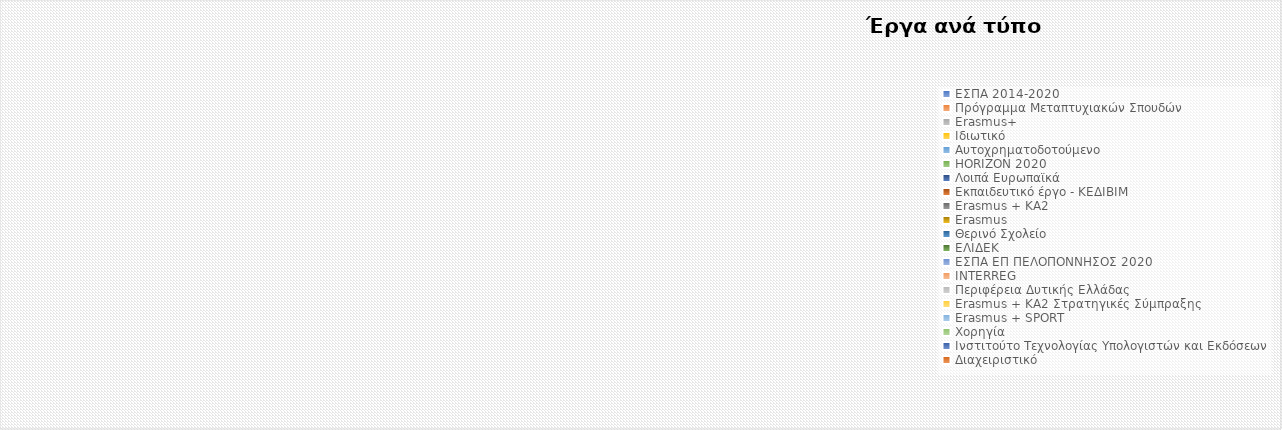
| Category | Έργα |
|---|---|
| ΕΣΠΑ 2014-2020 | 0 |
| Πρόγραμμα Μεταπτυχιακών Σπουδών | 0 |
| Erasmus+ | 0 |
| Ιδιωτικό | 0 |
| Αυτοχρηματοδοτούμενο | 0 |
| HORIZON 2020 | 0 |
| Λοιπά Ευρωπαϊκά | 0 |
| Εκπαιδευτικό έργο - ΚΕΔΙΒΙΜ | 0 |
| Erasmus + KA2 | 0 |
| Erasmus | 0 |
| Θερινό Σχολείο | 0 |
| ΕΛΙΔΕΚ | 0 |
| ΕΣΠΑ ΕΠ ΠΕΛΟΠΟΝΝΗΣΟΣ 2020 | 0 |
| INTERREG | 0 |
| Περιφέρεια Δυτικής Ελλάδας | 0 |
| Erasmus + KA2 Στρατηγικές Σύμπραξης | 0 |
| Erasmus + SPORT | 0 |
| Χορηγία | 0 |
| Ινστιτούτο Τεχνολογίας Υπολογιστών και Εκδόσεων  | 0 |
| Διαχειριστικό | 0 |